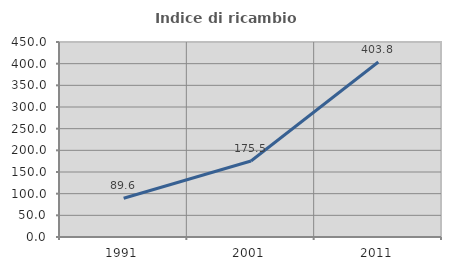
| Category | Indice di ricambio occupazionale  |
|---|---|
| 1991.0 | 89.552 |
| 2001.0 | 175.51 |
| 2011.0 | 403.846 |